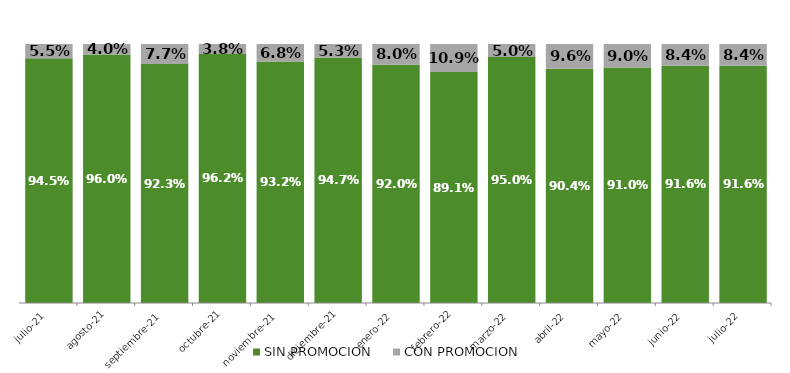
| Category | SIN PROMOCION   | CON PROMOCION   |
|---|---|---|
| 2021-07-01 | 0.945 | 0.055 |
| 2021-08-01 | 0.96 | 0.04 |
| 2021-09-01 | 0.923 | 0.077 |
| 2021-10-01 | 0.962 | 0.038 |
| 2021-11-01 | 0.932 | 0.068 |
| 2021-12-01 | 0.947 | 0.053 |
| 2022-01-01 | 0.92 | 0.08 |
| 2022-02-01 | 0.891 | 0.109 |
| 2022-03-01 | 0.95 | 0.05 |
| 2022-04-01 | 0.904 | 0.096 |
| 2022-05-01 | 0.91 | 0.09 |
| 2022-06-01 | 0.916 | 0.084 |
| 2022-07-01 | 0.916 | 0.084 |